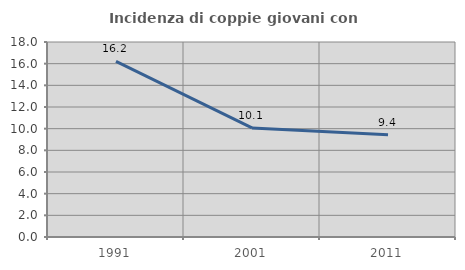
| Category | Incidenza di coppie giovani con figli |
|---|---|
| 1991.0 | 16.214 |
| 2001.0 | 10.072 |
| 2011.0 | 9.441 |